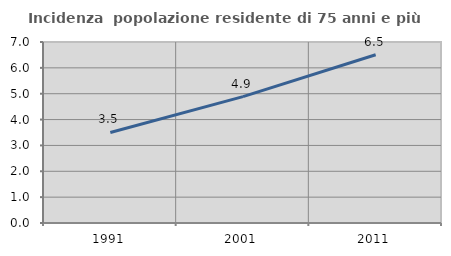
| Category | Incidenza  popolazione residente di 75 anni e più |
|---|---|
| 1991.0 | 3.502 |
| 2001.0 | 4.888 |
| 2011.0 | 6.506 |